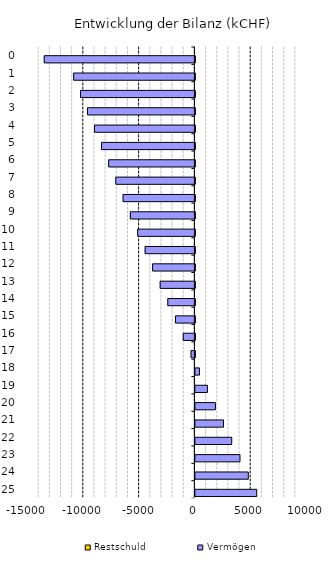
| Category | Restschuld  | Vermögen  |
|---|---|---|
| 0.0 | 0 | -13500 |
| 1.0 | 0 | -10863 |
| 2.0 | 0 | -10246.109 |
| 3.0 | 0 | -9624.237 |
| 4.0 | 0 | -8997.297 |
| 5.0 | 0 | -8365.197 |
| 6.0 | 0 | -7727.851 |
| 7.0 | 0 | -7085.167 |
| 8.0 | 0 | -6437.057 |
| 9.0 | 0 | -5783.433 |
| 10.0 | 0 | -5124.206 |
| 11.0 | 0 | -4459.288 |
| 12.0 | 0 | -3788.59 |
| 13.0 | 0 | -3112.025 |
| 14.0 | 0 | -2429.507 |
| 15.0 | 0 | -1740.948 |
| 16.0 | 0 | -1046.264 |
| 17.0 | 0 | -345.37 |
| 18.0 | 0 | 361.819 |
| 19.0 | 0 | 1075.385 |
| 20.0 | 0 | 1795.41 |
| 21.0 | 0 | 2521.976 |
| 22.0 | 0 | 3255.16 |
| 23.0 | 0 | 3995.042 |
| 24.0 | 0 | 4741.698 |
| 25.0 | 0 | 5495.202 |